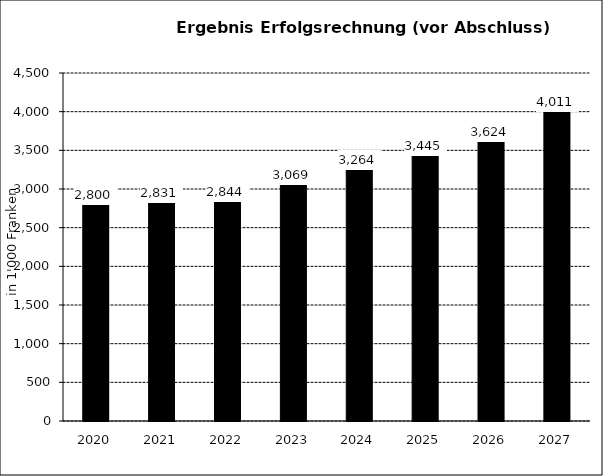
| Category | Ergebnis Laufende Rechnung kumuliert |
|---|---|
| 2020.0 | 2800 |
| 2021.0 | 2831 |
| 2022.0 | 2844 |
| 2023.0 | 3069.362 |
| 2024.0 | 3264.109 |
| 2025.0 | 3445.067 |
| 2026.0 | 3624.276 |
| 2027.0 | 4011.05 |